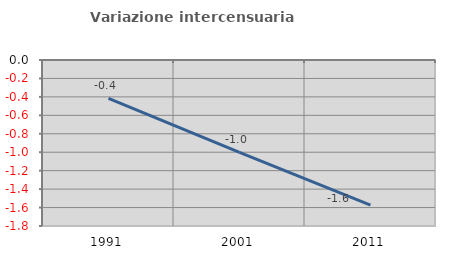
| Category | Variazione intercensuaria annua |
|---|---|
| 1991.0 | -0.416 |
| 2001.0 | -1.001 |
| 2011.0 | -1.574 |